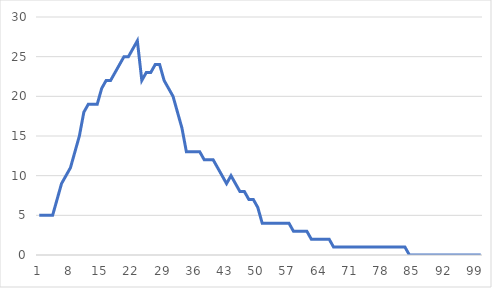
| Category | Series 0 |
|---|---|
| 0 | 5 |
| 1 | 5 |
| 2 | 5 |
| 3 | 5 |
| 4 | 7 |
| 5 | 9 |
| 6 | 10 |
| 7 | 11 |
| 8 | 13 |
| 9 | 15 |
| 10 | 18 |
| 11 | 19 |
| 12 | 19 |
| 13 | 19 |
| 14 | 21 |
| 15 | 22 |
| 16 | 22 |
| 17 | 23 |
| 18 | 24 |
| 19 | 25 |
| 20 | 25 |
| 21 | 26 |
| 22 | 27 |
| 23 | 22 |
| 24 | 23 |
| 25 | 23 |
| 26 | 24 |
| 27 | 24 |
| 28 | 22 |
| 29 | 21 |
| 30 | 20 |
| 31 | 18 |
| 32 | 16 |
| 33 | 13 |
| 34 | 13 |
| 35 | 13 |
| 36 | 13 |
| 37 | 12 |
| 38 | 12 |
| 39 | 12 |
| 40 | 11 |
| 41 | 10 |
| 42 | 9 |
| 43 | 10 |
| 44 | 9 |
| 45 | 8 |
| 46 | 8 |
| 47 | 7 |
| 48 | 7 |
| 49 | 6 |
| 50 | 4 |
| 51 | 4 |
| 52 | 4 |
| 53 | 4 |
| 54 | 4 |
| 55 | 4 |
| 56 | 4 |
| 57 | 3 |
| 58 | 3 |
| 59 | 3 |
| 60 | 3 |
| 61 | 2 |
| 62 | 2 |
| 63 | 2 |
| 64 | 2 |
| 65 | 2 |
| 66 | 1 |
| 67 | 1 |
| 68 | 1 |
| 69 | 1 |
| 70 | 1 |
| 71 | 1 |
| 72 | 1 |
| 73 | 1 |
| 74 | 1 |
| 75 | 1 |
| 76 | 1 |
| 77 | 1 |
| 78 | 1 |
| 79 | 1 |
| 80 | 1 |
| 81 | 1 |
| 82 | 1 |
| 83 | 0 |
| 84 | 0 |
| 85 | 0 |
| 86 | 0 |
| 87 | 0 |
| 88 | 0 |
| 89 | 0 |
| 90 | 0 |
| 91 | 0 |
| 92 | 0 |
| 93 | 0 |
| 94 | 0 |
| 95 | 0 |
| 96 | 0 |
| 97 | 0 |
| 98 | 0 |
| 99 | 0 |